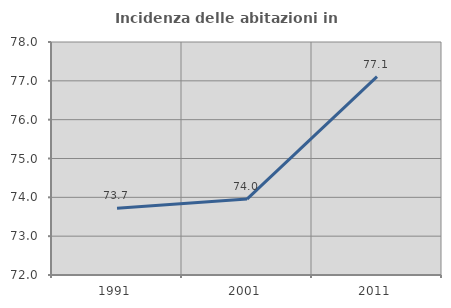
| Category | Incidenza delle abitazioni in proprietà  |
|---|---|
| 1991.0 | 73.72 |
| 2001.0 | 73.955 |
| 2011.0 | 77.108 |